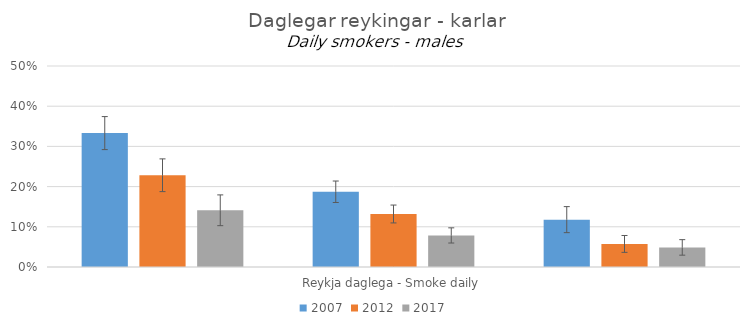
| Category | 2007 | 2012 | 2017 |
|---|---|---|---|
| 0 | 0.333 | 0.228 | 0.141 |
| 1 | 0.187 | 0.132 | 0.079 |
| 2 | 0.118 | 0.057 | 0.049 |